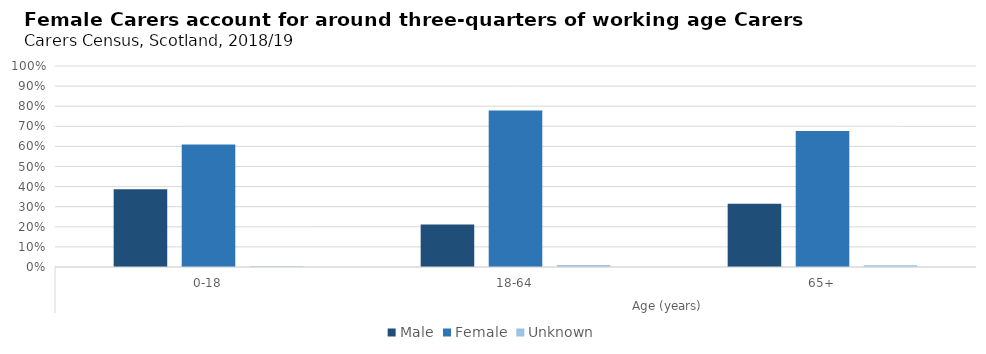
| Category | Male | Female | Unknown |
|---|---|---|---|
| 0 | 0.387 | 0.609 | 0.004 |
| 1 | 0.211 | 0.779 | 0.01 |
| 2 | 0.315 | 0.676 | 0.009 |